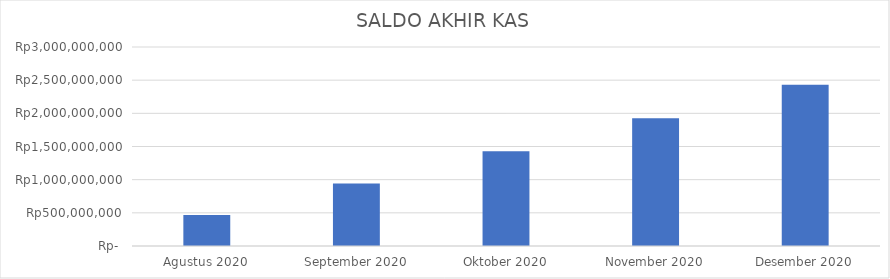
| Category | Series 0 |
|---|---|
| Agustus 2020 | 466900000 |
| September 2020 | 942800000 |
| Oktober 2020 | 1428700000 |
| November 2020 | 1924600000 |
| Desember 2020 | 2430500000 |